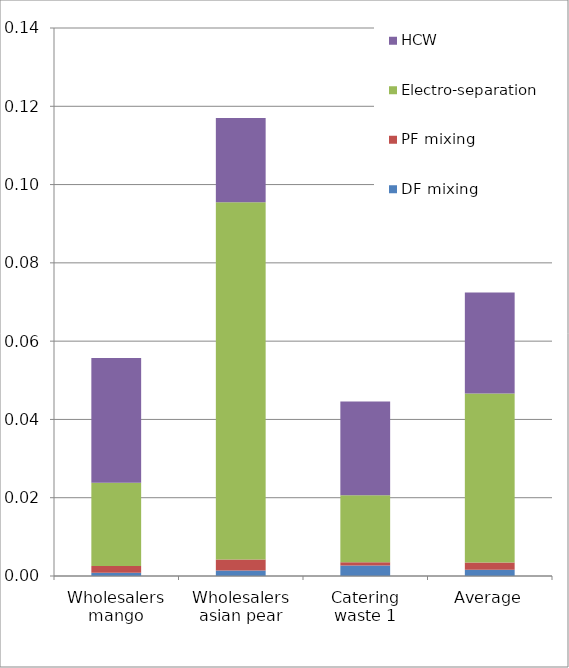
| Category | DF mixing | PF mixing | Electro-separation | HCW |
|---|---|---|---|---|
| Wholesalers mango | 0.001 | 0.002 | 0.021 | 0.032 |
| Wholesalers asian pear | 0.001 | 0.003 | 0.091 | 0.022 |
| Catering waste 1 | 0.003 | 0.001 | 0.017 | 0.024 |
| Average | 0.002 | 0.002 | 0.043 | 0.026 |